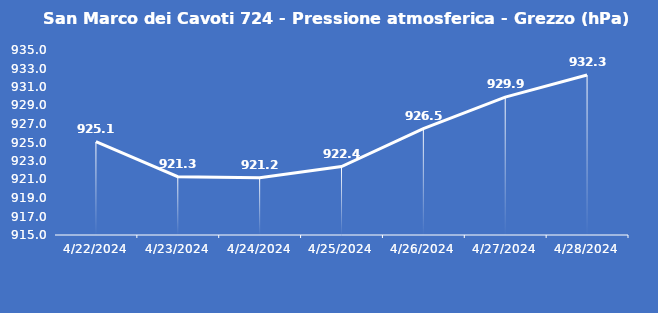
| Category | San Marco dei Cavoti 724 - Pressione atmosferica - Grezzo (hPa) |
|---|---|
| 4/22/24 | 925.1 |
| 4/23/24 | 921.3 |
| 4/24/24 | 921.2 |
| 4/25/24 | 922.4 |
| 4/26/24 | 926.5 |
| 4/27/24 | 929.9 |
| 4/28/24 | 932.3 |